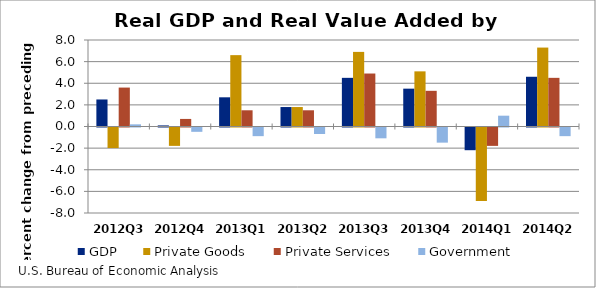
| Category | GDP | Private Goods | Private Services | Government |
|---|---|---|---|---|
| 2012Q3 | 2.5 | -1.9 | 3.6 | 0.2 |
| 2012Q4 | 0.1 | -1.7 | 0.7 | -0.4 |
| 2013Q1 | 2.7 | 6.6 | 1.5 | -0.8 |
| 2013Q2 | 1.8 | 1.8 | 1.5 | -0.6 |
| 2013Q3 | 4.5 | 6.9 | 4.9 | -1 |
| 2013Q4 | 3.5 | 5.1 | 3.3 | -1.4 |
| 2014Q1 | -2.1 | -6.8 | -1.7 | 1 |
| 2014Q2 | 4.6 | 7.3 | 4.5 | -0.8 |